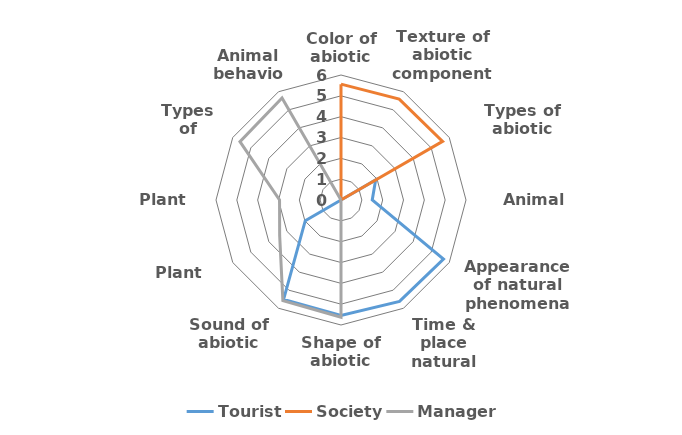
| Category | Tourist | Society | Manager |
|---|---|---|---|
| Color of abiotic components | 0 | 5.56 | 0 |
| Texture of abiotic components | 0 | 5.59 | 0 |
| Types of abiotic components | 1.92 | 5.63 | 0 |
| Animal bodies | 1.5 | 0 | 0 |
| Appearance of natural phenomena | 5.68 | 0 | 0 |
| Time & place natural phenomena | 5.62 | 0 | 0 |
| Shape of abiotic components | 5.54 | 0 | 5.63 |
| Sound of abiotic components | 5.51 | 0 | 5.58 |
| Plant parts | 1.98 | 0 | 3.4 |
| Plant color | 0 | 0 | 2.95 |
| Types of animals | 0 | 0 | 5.6 |
| Animal behavior | 0 | 0 | 5.66 |